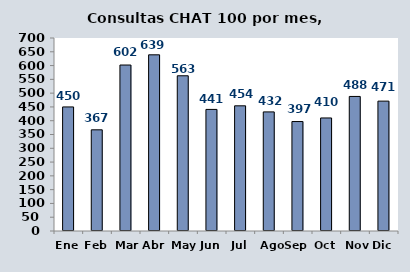
| Category | Series 0 |
|---|---|
| Ene | 450 |
| Feb | 367 |
| Mar | 602 |
| Abr | 639 |
| May | 563 |
| Jun | 441 |
| Jul | 454 |
| Ago | 432 |
| Sep | 397 |
| Oct | 410 |
| Nov | 488 |
| Dic | 471 |